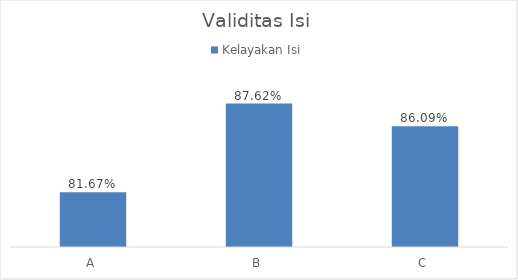
| Category | Kelayakan Isi |
|---|---|
| A | 0.817 |
| B | 0.876 |
| C | 0.861 |